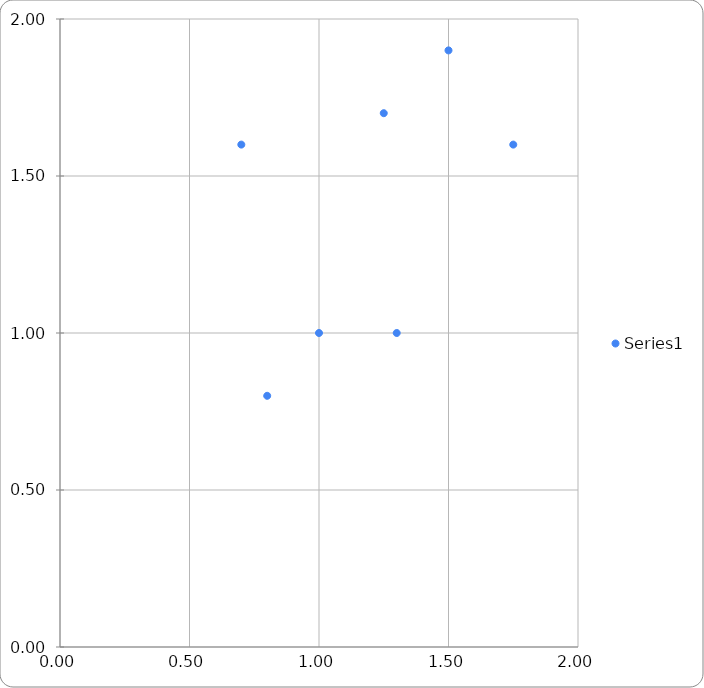
| Category | Series 0 |
|---|---|
| 1.0 | 1 |
| 1.25 | 1.7 |
| 1.5 | 1.9 |
| 0.7 | 1.6 |
| 1.75 | 1.6 |
| 0.8 | 0.8 |
| 1.3 | 1 |